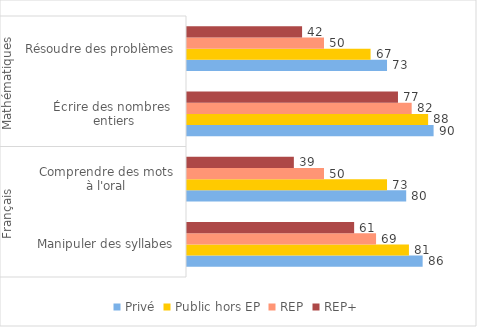
| Category | Privé | Public hors EP | REP | REP+ |
|---|---|---|---|---|
| 0 | 86 | 81 | 69 | 61 |
| 1 | 80 | 73 | 50 | 39 |
| 2 | 90 | 88 | 82 | 77 |
| 3 | 73 | 67 | 50 | 42 |